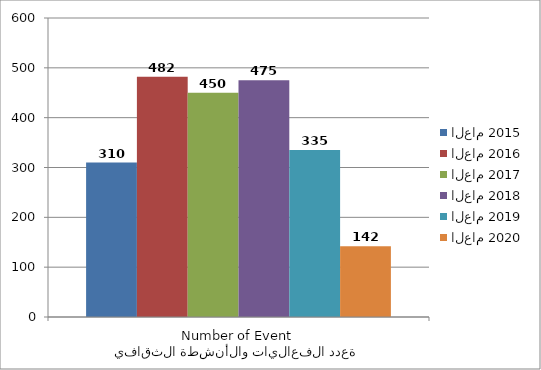
| Category | العام 2015 | العام 2016 | العام 2017 | العام 2018 | العام 2019 | العام 2020 |
|---|---|---|---|---|---|---|
| عدد الفعاليات والأنشطة الثقافية
Number of Events | 310 | 482 | 450 | 475 | 335 | 142 |